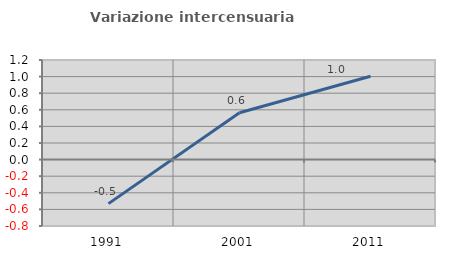
| Category | Variazione intercensuaria annua |
|---|---|
| 1991.0 | -0.53 |
| 2001.0 | 0.564 |
| 2011.0 | 1.004 |